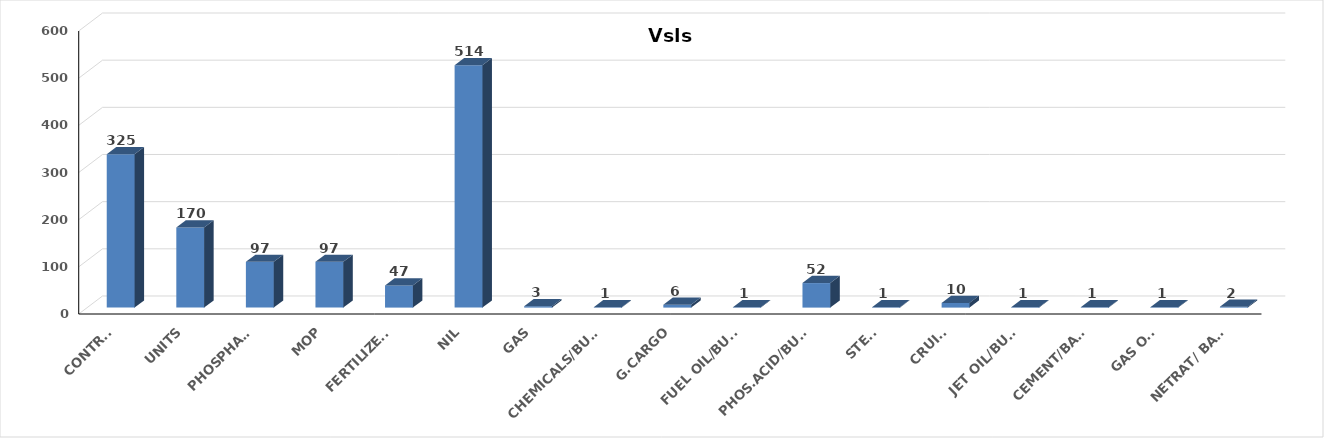
| Category | Series 0 |
|---|---|
| CONTRS. | 325 |
| UNITS | 170 |
| PHOSPHATE | 97 |
| MOP | 97 |
| FERTILIZERS | 47 |
| NIL | 514 |
| GAS | 3 |
| CHEMICALS/BULK | 1 |
| G.CARGO | 6 |
| FUEL OIL/BULK | 1 |
| PHOS.ACID/BULK | 52 |
| STEEL | 1 |
| CRUISE | 10 |
| JET OIL/BULK | 1 |
| CEMENT/BAGS | 1 |
| GAS OIL | 1 |
| NETRAT/ BAGS | 2 |